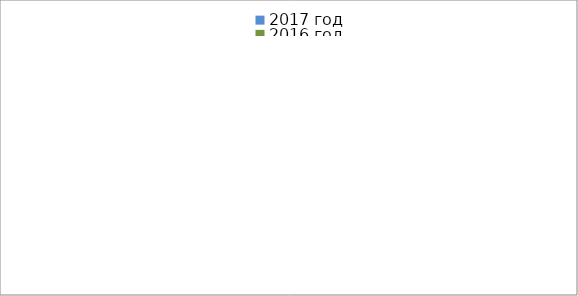
| Category | 2017 год | 2016 год |
|---|---|---|
|  - поджог | 7 | 9 |
|  - неосторожное обращение с огнём | 1 | 2 |
|  - НПТЭ электрооборудования | 12 | 8 |
|  - НПУ и Э печей | 34 | 24 |
|  - НПУ и Э транспортных средств | 26 | 30 |
|   -Шалость с огнем детей | 3 | 3 |
|  -НППБ при эксплуатации эл.приборов | 12 | 18 |
|  - курение | 14 | 16 |
| - прочие | 35 | 36 |
| - не установленные причины | 0 | 0 |